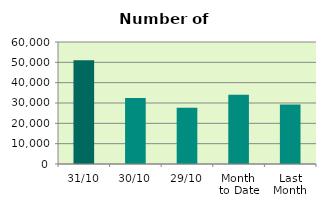
| Category | Series 0 |
|---|---|
| 31/10 | 51064 |
| 30/10 | 32480 |
| 29/10 | 27684 |
| Month 
to Date | 34034.348 |
| Last
Month | 29250.6 |